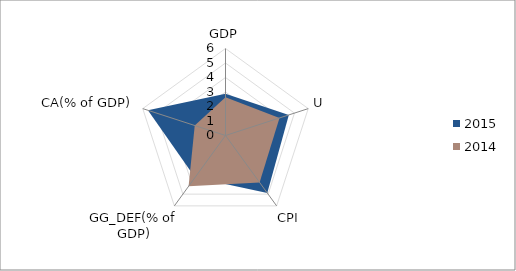
| Category | 2015 | 2014 |
|---|---|---|
| GDP | 2.88 | 2.64 |
| U | 4.592 | 3.913 |
| CPI | 4.9 | 4 |
| GG_DEF(% of GDP) | 3.571 | 4.33 |
| CA(% of GDP) | 5.625 | 2.23 |